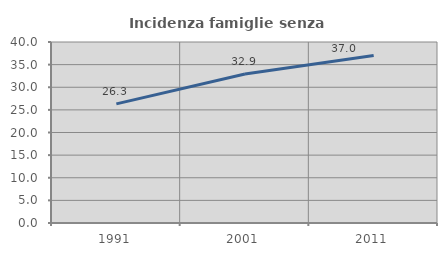
| Category | Incidenza famiglie senza nuclei |
|---|---|
| 1991.0 | 26.326 |
| 2001.0 | 32.917 |
| 2011.0 | 37.016 |